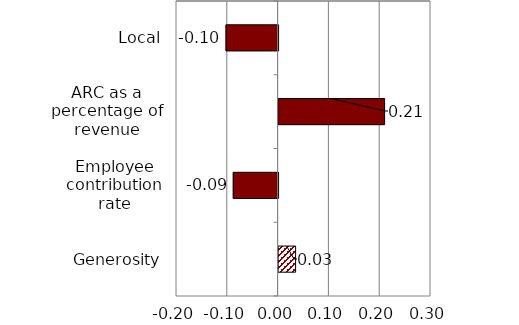
| Category | Series 0 |
|---|---|
| Local | -0.103 |
| ARC as a percentage of revenue | 0.209 |
| Employee contribution rate | -0.088 |
| Generosity | 0.033 |